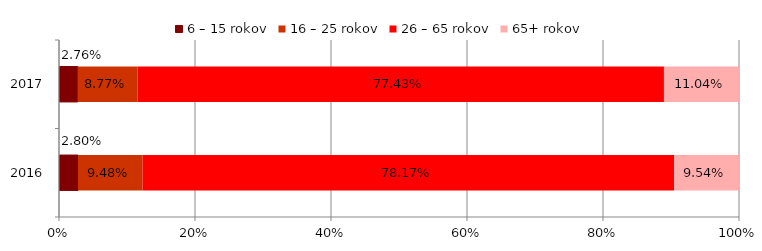
| Category | 6 – 15 rokov | 16 – 25 rokov | 26 – 65 rokov | 65+ rokov |
|---|---|---|---|---|
| 2016.0 | 0.028 | 0.095 | 0.782 | 0.095 |
| 2017.0 | 0.028 | 0.088 | 0.774 | 0.11 |